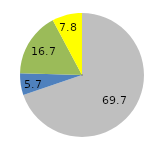
| Category | Series 0 |
|---|---|
| 0 | 69.7 |
| 1 | 5.7 |
| 2 | 16.7 |
| 3 | 7.8 |